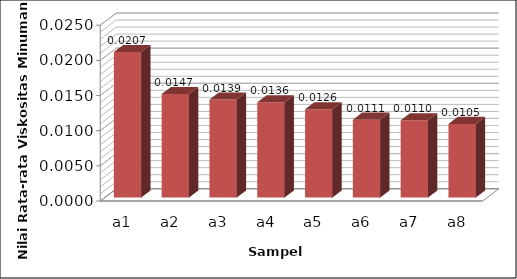
| Category | Series 0 |
|---|---|
| a1 | 0.021 |
| a2 | 0.015 |
| a3 | 0.014 |
| a4 | 0.014 |
| a5 | 0.013 |
| a6 | 0.011 |
| a7 | 0.011 |
| a8 | 0.01 |